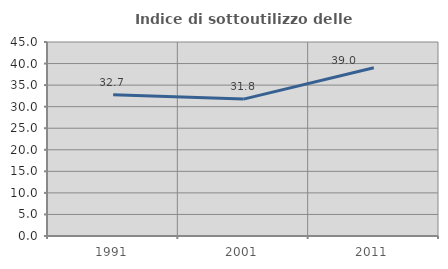
| Category | Indice di sottoutilizzo delle abitazioni  |
|---|---|
| 1991.0 | 32.735 |
| 2001.0 | 31.757 |
| 2011.0 | 39.024 |